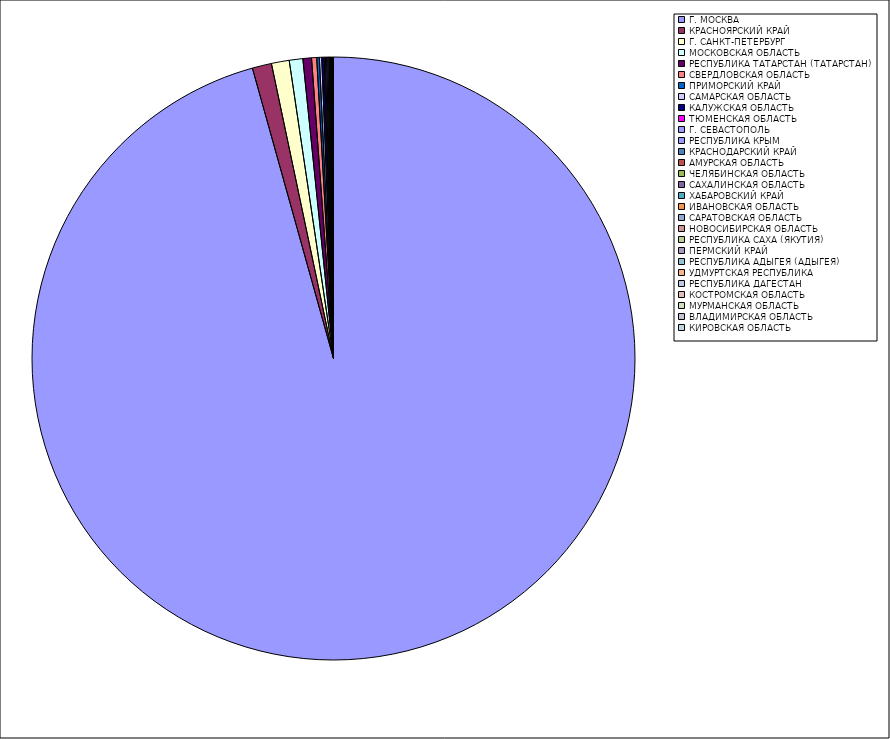
| Category | Оборот |
|---|---|
| Г. МОСКВА | 95.617 |
| КРАСНОЯРСКИЙ КРАЙ | 1.033 |
| Г. САНКТ-ПЕТЕРБУРГ | 0.952 |
| МОСКОВСКАЯ ОБЛАСТЬ | 0.727 |
| РЕСПУБЛИКА ТАТАРСТАН (ТАТАРСТАН) | 0.46 |
| СВЕРДЛОВСКАЯ ОБЛАСТЬ | 0.274 |
| ПРИМОРСКИЙ КРАЙ | 0.139 |
| САМАРСКАЯ ОБЛАСТЬ | 0.127 |
| КАЛУЖСКАЯ ОБЛАСТЬ | 0.126 |
| ТЮМЕНСКАЯ ОБЛАСТЬ | 0.068 |
| Г. СЕВАСТОПОЛЬ | 0.064 |
| РЕСПУБЛИКА КРЫМ | 0.064 |
| КРАСНОДАРСКИЙ КРАЙ | 0.063 |
| АМУРСКАЯ ОБЛАСТЬ | 0.044 |
| ЧЕЛЯБИНСКАЯ ОБЛАСТЬ | 0.04 |
| САХАЛИНСКАЯ ОБЛАСТЬ | 0.025 |
| ХАБАРОВСКИЙ КРАЙ | 0.019 |
| ИВАНОВСКАЯ ОБЛАСТЬ | 0.017 |
| САРАТОВСКАЯ ОБЛАСТЬ | 0.015 |
| НОВОСИБИРСКАЯ ОБЛАСТЬ | 0.011 |
| РЕСПУБЛИКА САХА (ЯКУТИЯ) | 0.011 |
| ПЕРМСКИЙ КРАЙ | 0.011 |
| РЕСПУБЛИКА АДЫГЕЯ (АДЫГЕЯ) | 0.008 |
| УДМУРТСКАЯ РЕСПУБЛИКА | 0.007 |
| РЕСПУБЛИКА ДАГЕСТАН | 0.007 |
| КОСТРОМСКАЯ ОБЛАСТЬ | 0.007 |
| МУРМАНСКАЯ ОБЛАСТЬ | 0.006 |
| ВЛАДИМИРСКАЯ ОБЛАСТЬ | 0.005 |
| КИРОВСКАЯ ОБЛАСТЬ | 0.005 |